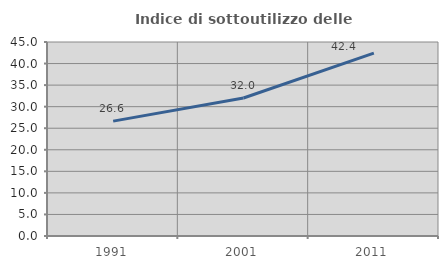
| Category | Indice di sottoutilizzo delle abitazioni  |
|---|---|
| 1991.0 | 26.641 |
| 2001.0 | 32.016 |
| 2011.0 | 42.401 |